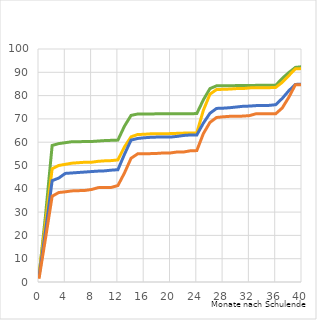
| Category | 1,00 1 Nicht-Migranten Mann | 2,00 2 Nicht-Migranten Frau | 3,00 3 Migranten Mann | 4,00 4 Migranten Frau |
|---|---|---|---|---|
| 0.0 | 2.4 | 3.3 | 2.3 | 1.4 |
| 1.0 | 28.8 | 25.5 | 22 | 18.9 |
| 2.0 | 58.6 | 48.6 | 43.5 | 36.8 |
| 3.0 | 59.4 | 50 | 44.6 | 38.4 |
| 4.0 | 59.8 | 50.5 | 46.6 | 38.7 |
| 5.0 | 60.2 | 51 | 46.8 | 39.1 |
| 6.0 | 60.2 | 51.2 | 47 | 39.2 |
| 7.0 | 60.3 | 51.4 | 47.2 | 39.3 |
| 8.0 | 60.3 | 51.4 | 47.4 | 39.7 |
| 9.0 | 60.5 | 51.8 | 47.6 | 40.5 |
| 10.0 | 60.7 | 52 | 47.7 | 40.6 |
| 11.0 | 60.8 | 52.1 | 48 | 40.6 |
| 12.0 | 60.9 | 52.4 | 48.2 | 41.4 |
| 13.0 | 66.9 | 58 | 54.8 | 46.8 |
| 14.0 | 71.5 | 62.3 | 60.9 | 53.1 |
| 15.0 | 72.1 | 63.3 | 61.6 | 55 |
| 16.0 | 72.1 | 63.4 | 61.9 | 55 |
| 17.0 | 72.1 | 63.6 | 62.1 | 55.1 |
| 18.0 | 72.2 | 63.6 | 62.2 | 55.2 |
| 19.0 | 72.2 | 63.6 | 62.2 | 55.4 |
| 20.0 | 72.2 | 63.7 | 62.2 | 55.4 |
| 21.0 | 72.2 | 63.8 | 62.5 | 55.8 |
| 22.0 | 72.2 | 63.9 | 62.9 | 55.8 |
| 23.0 | 72.2 | 63.9 | 63.1 | 56.3 |
| 24.0 | 72.3 | 64 | 63.1 | 56.4 |
| 25.0 | 78.2 | 73.7 | 68.2 | 63.7 |
| 26.0 | 83 | 80.6 | 72.4 | 68.5 |
| 27.0 | 84.2 | 82.6 | 74.5 | 70.6 |
| 28.0 | 84.2 | 82.7 | 74.6 | 70.9 |
| 29.0 | 84.2 | 82.8 | 74.8 | 71.1 |
| 30.0 | 84.3 | 83 | 75.1 | 71.1 |
| 31.0 | 84.3 | 83 | 75.4 | 71.2 |
| 32.0 | 84.3 | 83.3 | 75.5 | 71.4 |
| 33.0 | 84.4 | 83.4 | 75.7 | 72.2 |
| 34.0 | 84.4 | 83.4 | 75.7 | 72.2 |
| 35.0 | 84.4 | 83.4 | 75.8 | 72.2 |
| 36.0 | 84.4 | 83.5 | 76.1 | 72.2 |
| 37.0 | 87.4 | 85.7 | 78.8 | 74.7 |
| 38.0 | 89.9 | 88.6 | 82.1 | 79.3 |
| 39.0 | 92.1 | 91.5 | 84.8 | 84.7 |
| 40.0 | 92.4 | 91.6 | 84.9 | 84.7 |